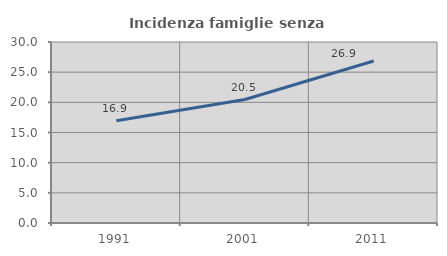
| Category | Incidenza famiglie senza nuclei |
|---|---|
| 1991.0 | 16.935 |
| 2001.0 | 20.464 |
| 2011.0 | 26.852 |